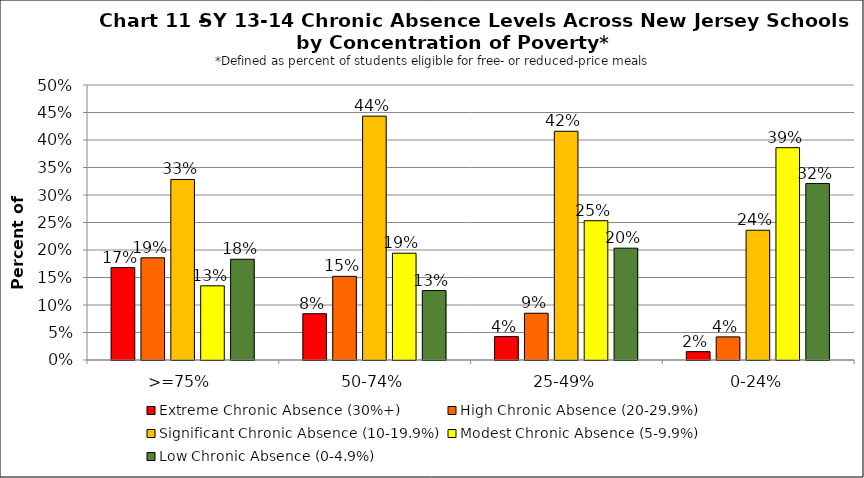
| Category | Extreme Chronic Absence (30%+) | High Chronic Absence (20-29.9%) | Significant Chronic Absence (10-19.9%) | Modest Chronic Absence (5-9.9%) | Low Chronic Absence (0-4.9%) |
|---|---|---|---|---|---|
| 0 | 0.168 | 0.186 | 0.328 | 0.135 | 0.183 |
| 1 | 0.084 | 0.152 | 0.443 | 0.194 | 0.126 |
| 2 | 0.043 | 0.085 | 0.416 | 0.253 | 0.203 |
| 3 | 0.015 | 0.042 | 0.236 | 0.386 | 0.321 |